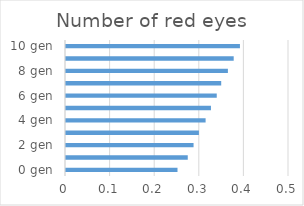
| Category | Number of red eyes |
|---|---|
| 0 gen | 0.25 |
| 1 gen | 0.273 |
| 2 gen | 0.286 |
| 3 gen | 0.298 |
| 4 gen | 0.313 |
| 5 gen | 0.325 |
| 6 gen | 0.338 |
| 7 gen | 0.348 |
| 8 gen | 0.363 |
| 9 gen | 0.376 |
| 10 gen | 0.39 |